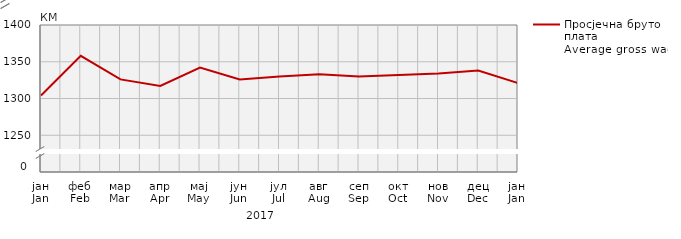
| Category | Просјечна бруто плата
Average gross wage |
|---|---|
| јан
Jan | 1304 |
| феб
Feb | 1358 |
| мар
Mar | 1326 |
| апр
Apr | 1317 |
| мај
May | 1342 |
| јун
Jun | 1326 |
| јул
Jul | 1330 |
| авг
Aug | 1333 |
| сеп
Sep | 1330 |
| окт
Oct | 1332 |
| нов
Nov | 1334 |
| дец
Dec | 1338 |
| јан
Jan | 1321 |